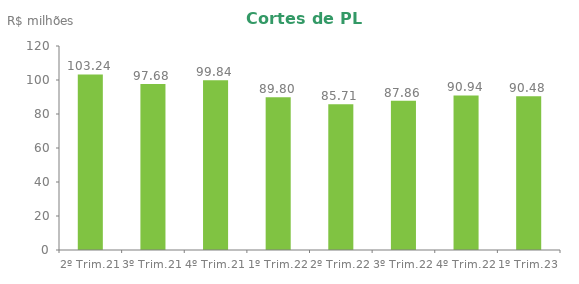
| Category | Series 0 |
|---|---|
| 2º Trim.21 | 103.241 |
| 3º Trim.21 | 97.678 |
| 4º Trim.21 | 99.84 |
| 1º Trim.22 | 89.798 |
| 2º Trim.22 | 85.707 |
| 3º Trim.22 | 87.86 |
| 4º Trim.22 | 90.94 |
| 1º Trim.23 | 90.48 |